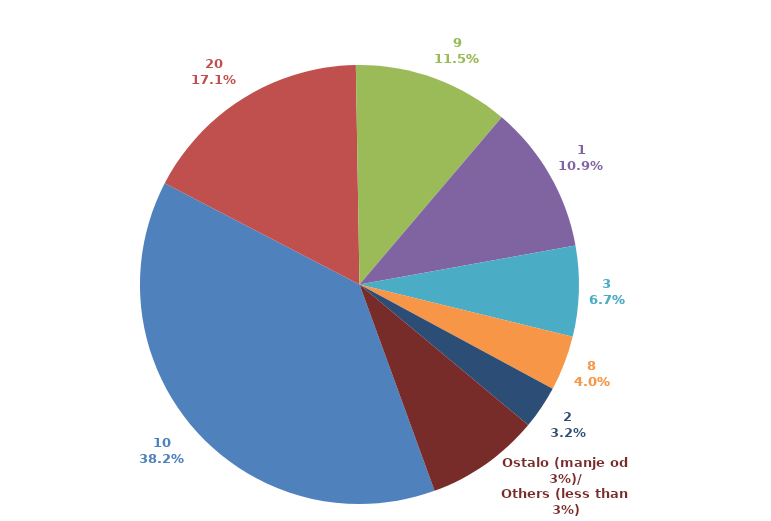
| Category | Series 0 |
|---|---|
| 10 | 0.382 |
| 20 | 0.171 |
| 9 | 0.115 |
| 1 | 0.109 |
| 3 | 0.067 |
| 8 | 0.04 |
| 2 | 0.032 |
| Ostalo (manje od 3%)/
Others (less than 3%) | 0.084 |